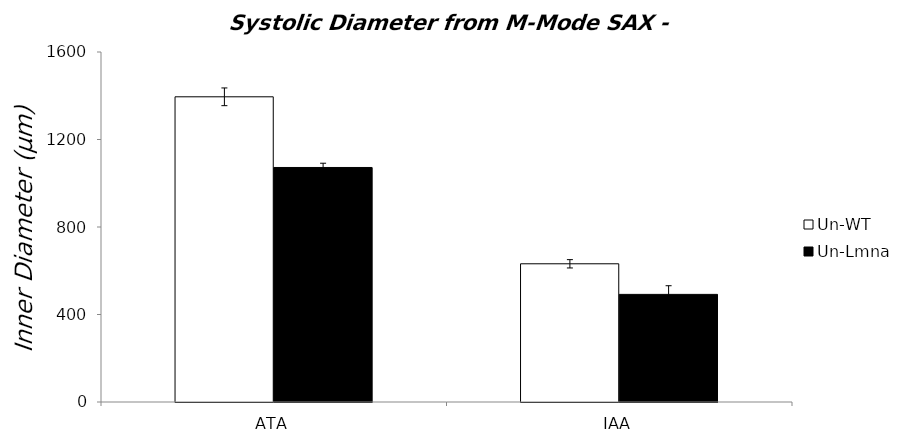
| Category | Un-WT | Un-Lmna |
|---|---|---|
| 0 | 1395.166 | 1072.096 |
| 1 | 631.79 | 491.987 |